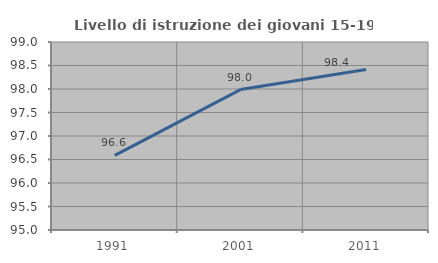
| Category | Livello di istruzione dei giovani 15-19 anni |
|---|---|
| 1991.0 | 96.589 |
| 2001.0 | 97.987 |
| 2011.0 | 98.416 |